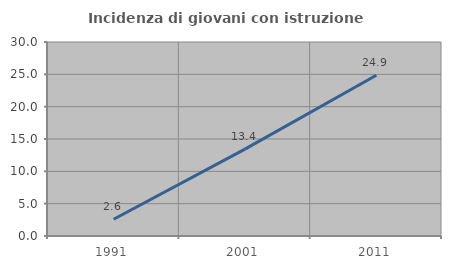
| Category | Incidenza di giovani con istruzione universitaria |
|---|---|
| 1991.0 | 2.585 |
| 2001.0 | 13.431 |
| 2011.0 | 24.859 |